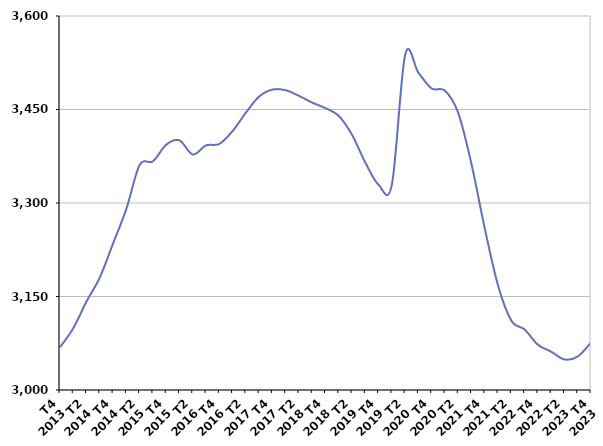
| Category | De 25 à 49 ans |
|---|---|
| T4
2013 | 3068.6 |
| T1
2014 | 3099.1 |
| T2
2014 | 3142.1 |
| T3
2014 | 3180.6 |
| T4
2014 | 3235.3 |
| T1
2015 | 3290.5 |
| T2
2015 | 3361 |
| T3
2015 | 3366.9 |
| T4
2015 | 3393.5 |
| T1
2016 | 3400.5 |
| T2
2016 | 3377.8 |
| T3
2016 | 3392.4 |
| T4
2016 | 3394.7 |
| T1
2017 | 3415.4 |
| T2
2017 | 3444.8 |
| T3
2017 | 3470.8 |
| T4
2017 | 3481.9 |
| T1
2018 | 3480.9 |
| T2
2018 | 3471.9 |
| T3
2018 | 3461.1 |
| T4
2018 | 3452.2 |
| T1
2019 | 3439.7 |
| T2
2019 | 3409.3 |
| T3
2019 | 3364.9 |
| T4
2019 | 3329.2 |
| T1
2020 | 3329.4 |
| T2
2020 | 3537.6 |
| T3
2020 | 3509 |
| T4
2020 | 3483.7 |
| T1
2021 | 3480.2 |
| T2
2021 | 3444.3 |
| T3
2021 | 3362.3 |
| T4
2021 | 3259 |
| T1
2022 | 3167.6 |
| T2
2022 | 3111.3 |
| T3
2022 | 3097 |
| T4
2022 | 3072.6 |
| T1
2023 | 3061.5 |
| T2
2023 | 3049 |
| T3
2023 | 3053.7 |
| T4
2023 | 3076.2 |